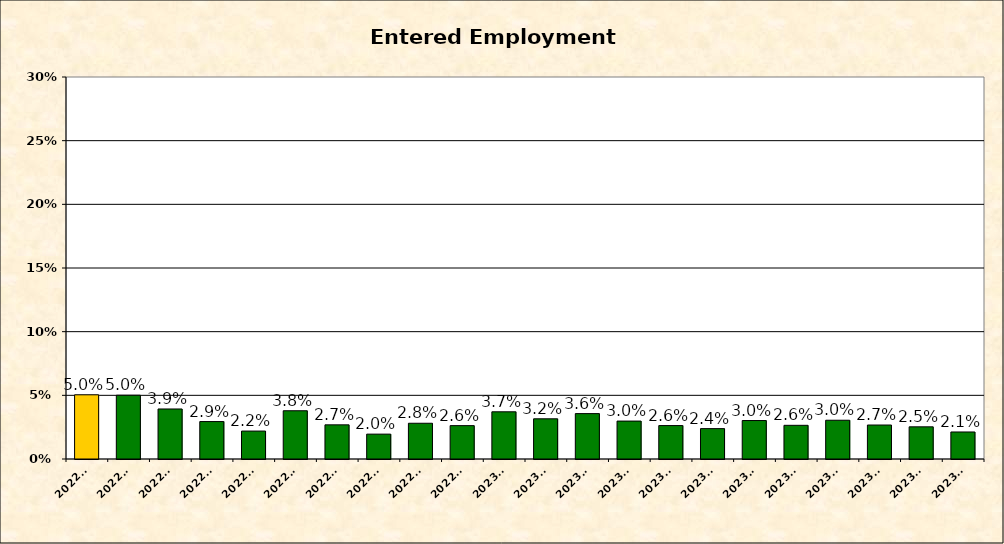
| Category | 202203 |
|---|---|
| 202203.0 | 0.05 |
| 202204.0 | 0.05 |
| 202205.0 | 0.039 |
| 202206.0 | 0.029 |
| 202207.0 | 0.022 |
| 202208.0 | 0.038 |
| 202209.0 | 0.027 |
| 202210.0 | 0.02 |
| 202211.0 | 0.028 |
| 202212.0 | 0.026 |
| 202301.0 | 0.037 |
| 202302.0 | 0.032 |
| 202303.0 | 0.036 |
| 202304.0 | 0.03 |
| 202305.0 | 0.026 |
| 202306.0 | 0.024 |
| 202307.0 | 0.03 |
| 202308.0 | 0.026 |
| 202309.0 | 0.03 |
| 202310.0 | 0.027 |
| 202311.0 | 0.025 |
| 202312.0 | 0.021 |